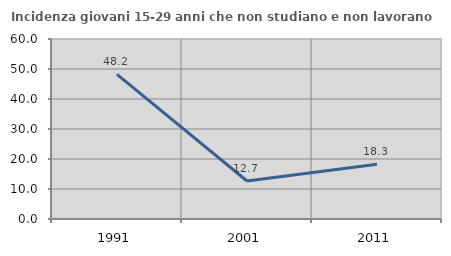
| Category | Incidenza giovani 15-29 anni che non studiano e non lavorano  |
|---|---|
| 1991.0 | 48.183 |
| 2001.0 | 12.667 |
| 2011.0 | 18.261 |